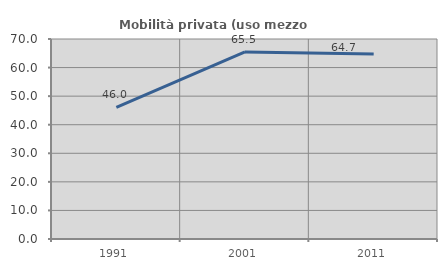
| Category | Mobilità privata (uso mezzo privato) |
|---|---|
| 1991.0 | 46.041 |
| 2001.0 | 65.472 |
| 2011.0 | 64.74 |